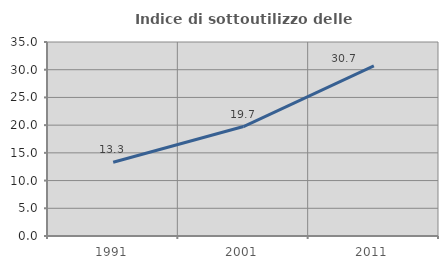
| Category | Indice di sottoutilizzo delle abitazioni  |
|---|---|
| 1991.0 | 13.295 |
| 2001.0 | 19.742 |
| 2011.0 | 30.692 |